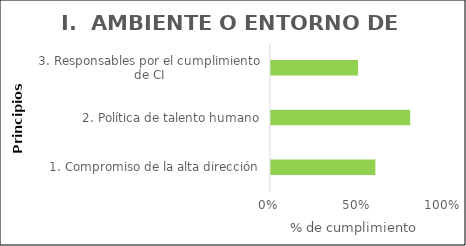
| Category | Principios |
|---|---|
| 1. Compromiso de la alta dirección | 0.6 |
| 2. Política de talento humano | 0.8 |
| 3. Responsables por el cumplimiento de CI | 0.5 |